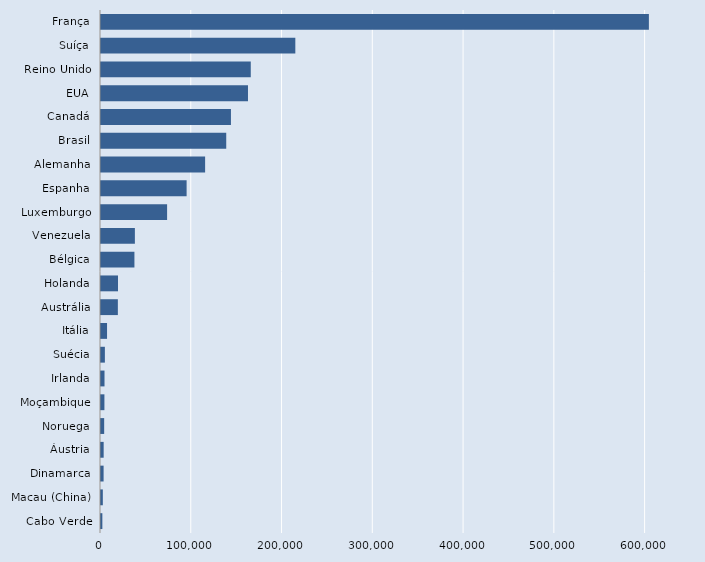
| Category | Series 0 |
|---|---|
| Cabo Verde | 1491 |
| Macau (China) | 2011 |
| Dinamarca | 2862 |
| Áustria | 2925 |
| Noruega | 3493 |
| Moçambique | 3767 |
| Irlanda | 3866 |
| Suécia | 4273 |
| Itália | 6657 |
| Austrália | 18570 |
| Holanda | 18713 |
| Bélgica | 36828 |
| Venezuela | 37326 |
| Luxemburgo | 72821 |
| Espanha | 94319 |
| Alemanha | 114705 |
| Brasil | 137973 |
| Canadá | 143160 |
| EUA | 161936 |
| Reino Unido | 165000 |
| Suíça | 214087 |
| França | 603600 |